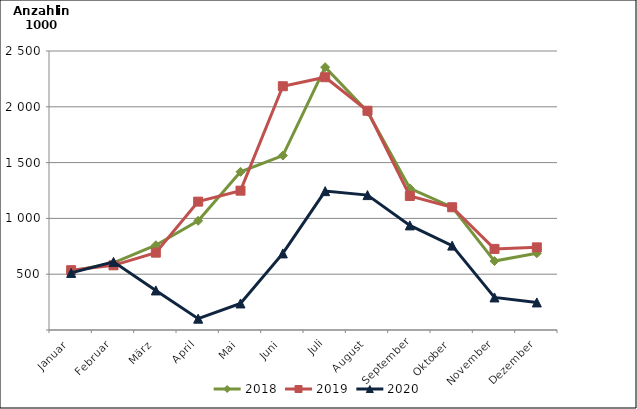
| Category | 2018 | 2019 | 2020 |
|---|---|---|---|
| Januar | 526.008 | 535.963 | 511.664 |
| Februar | 601.214 | 579.498 | 610.406 |
| März | 759.707 | 692.919 | 354.58 |
| April | 978.366 | 1150.261 | 101.267 |
| Mai | 1417.288 | 1248.55 | 237.949 |
| Juni | 1562.95 | 2184.369 | 686.258 |
| Juli | 2354.818 | 2265.057 | 1244.36 |
| August | 1956.322 | 1964.706 | 1208.794 |
| September | 1269.282 | 1200.938 | 937.428 |
| Oktober | 1100.383 | 1099.907 | 756.252 |
| November | 617.521 | 726.766 | 291.708 |
| Dezember | 687.698 | 740.391 | 247.013 |